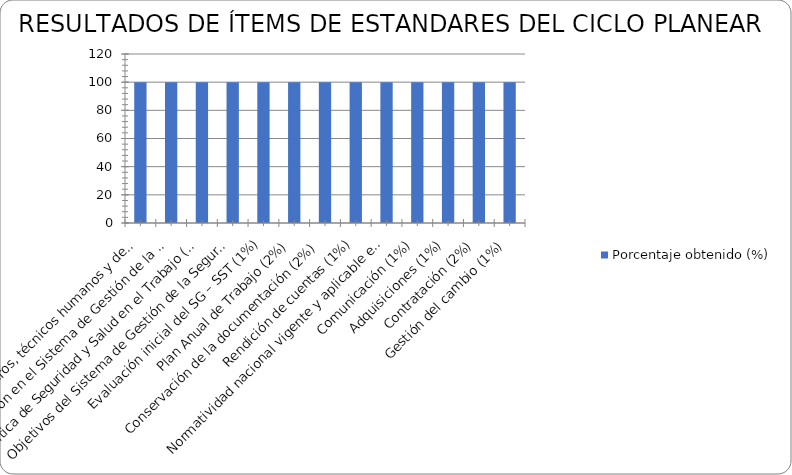
| Category | Porcentaje obtenido (%) |
|---|---|
| Recursos financieros, técnicos humanos y de otra índole requeridos para coordinar y desarrollar el Sistema de Gestión de la Seguridad y Salud en el Trabajo (SG-SST). (4%) | 100 |
| Capacitación en el Sistema de Gestión de la Seguridad y Salud en el Trabajo. (6%) | 100 |
| Política de Seguridad y Salud en el Trabajo (1%) | 100 |
| Objetivos del Sistema de Gestión de la Seguridad y Salud en el Trabajo SG-SST (1%) | 100 |
| Evaluación inicial del SG – SST (1%) | 100 |
| Plan Anual de Trabajo (2%) | 100 |
| Conservación de la documentación (2%) | 100 |
| Rendición de cuentas (1%) | 100 |
| Normatividad nacional vigente y aplicable en materia de seguridad y salud en el trabajo. (2%) | 100 |
| Comunicación (1%) | 100 |
| Adquisiciones (1%) | 100 |
| Contratación (2%) | 100 |
| Gestión del cambio (1%) | 100 |